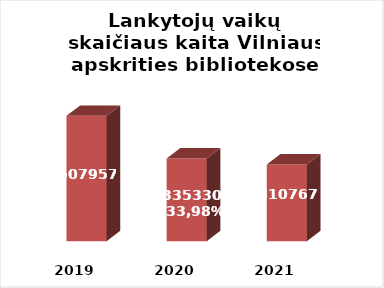
| Category | Series 0 |
|---|---|
| 2019.0 | 507957 |
| 2020.0 | 335330 |
| 2021.0 | 310767 |